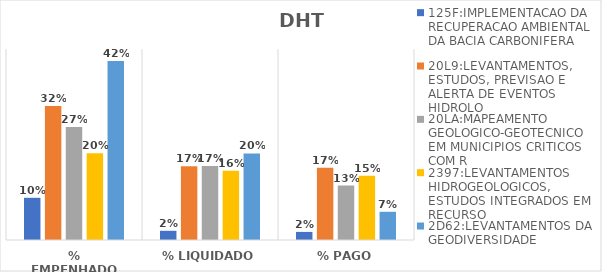
| Category | 125F:IMPLEMENTACAO DA RECUPERACAO AMBIENTAL DA BACIA CARBONIFERA | 20L9:LEVANTAMENTOS, ESTUDOS, PREVISAO E ALERTA DE EVENTOS HIDROLO | 20LA:MAPEAMENTO GEOLOGICO-GEOTECNICO EM MUNICIPIOS CRITICOS COM R | 2397:LEVANTAMENTOS HIDROGEOLOGICOS, ESTUDOS INTEGRADOS EM RECURSO | 2D62:LEVANTAMENTOS DA GEODIVERSIDADE |
|---|---|---|---|---|---|
| % EMPENHADO | 0.099 | 0.315 | 0.266 | 0.205 | 0.422 |
| % LIQUIDADO | 0.022 | 0.173 | 0.174 | 0.163 | 0.204 |
| % PAGO | 0.019 | 0.17 | 0.128 | 0.152 | 0.066 |